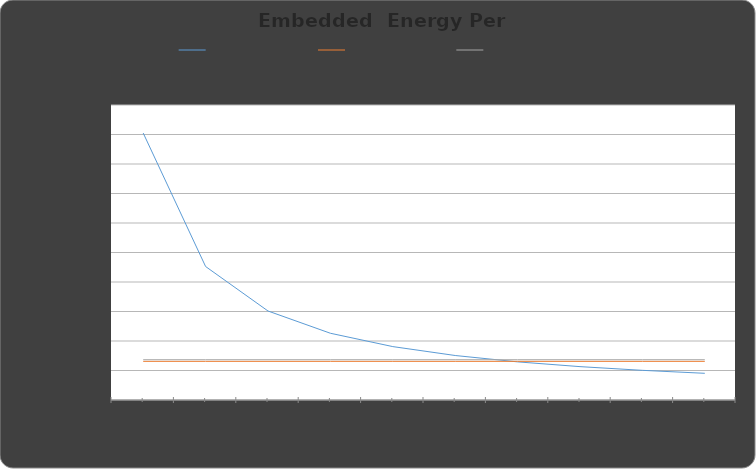
| Category | Mason Jar (kWh) | Paper Cup(kWh) | Plastic Cup (kWh) |
|---|---|---|---|
| 0 | 1.81 | 0.262 | 0.273 |
| 1 | 0.905 | 0.262 | 0.273 |
| 2 | 0.603 | 0.262 | 0.273 |
| 3 | 0.452 | 0.262 | 0.273 |
| 4 | 0.362 | 0.262 | 0.273 |
| 5 | 0.302 | 0.262 | 0.273 |
| 6 | 0.259 | 0.262 | 0.273 |
| 7 | 0.226 | 0.262 | 0.273 |
| 8 | 0.201 | 0.262 | 0.273 |
| 9 | 0.181 | 0.262 | 0.273 |